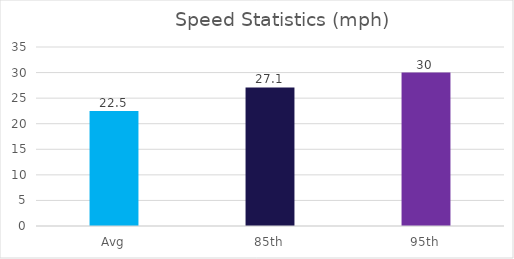
| Category | Series 0 |
|---|---|
| Avg | 22.5 |
| 85th | 27.1 |
| 95th | 30 |